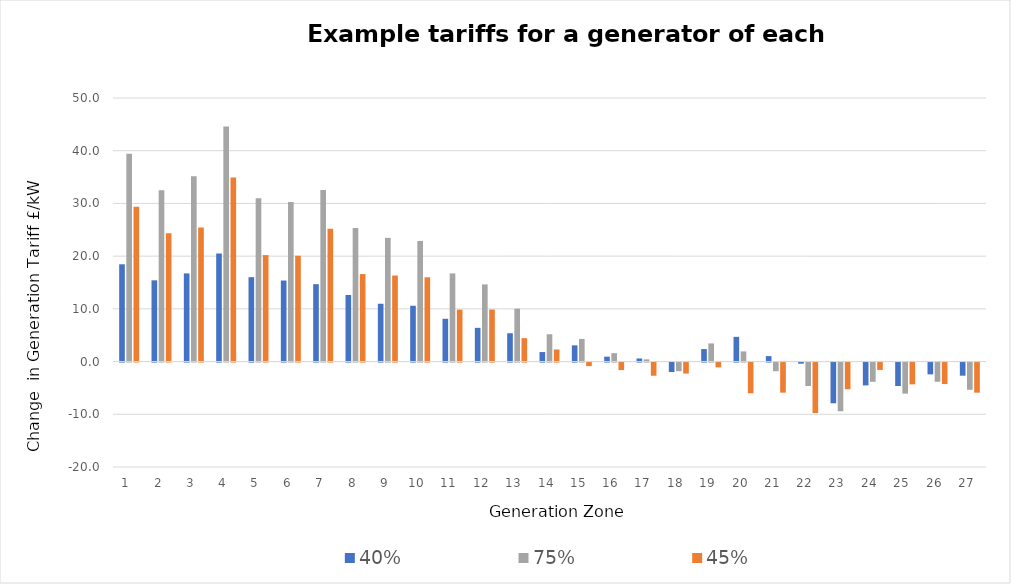
| Category | 40% | 75% | 45% |
|---|---|---|---|
| 1.0 | 18.457 | 39.446 | 29.355 |
| 2.0 | 15.413 | 32.486 | 24.32 |
| 3.0 | 16.728 | 35.138 | 25.434 |
| 4.0 | 20.501 | 44.603 | 34.922 |
| 5.0 | 16.007 | 31.002 | 20.197 |
| 6.0 | 15.374 | 30.292 | 20.077 |
| 7.0 | 14.683 | 32.545 | 25.215 |
| 8.0 | 12.626 | 25.317 | 16.598 |
| 9.0 | 10.967 | 23.475 | 16.318 |
| 10.0 | 10.592 | 22.881 | 15.992 |
| 11.0 | 8.118 | 16.723 | 9.851 |
| 12.0 | 6.399 | 14.64 | 9.879 |
| 13.0 | 5.373 | 10.038 | 4.444 |
| 14.0 | 1.804 | 5.179 | 2.295 |
| 15.0 | 3.077 | 4.299 | -0.671 |
| 16.0 | 0.932 | 1.595 | -1.425 |
| 17.0 | 0.592 | 0.421 | -2.496 |
| 18.0 | -1.784 | -1.636 | -2.086 |
| 19.0 | 2.371 | 3.446 | -0.894 |
| 20.0 | 4.69 | 1.932 | -5.822 |
| 21.0 | 1.036 | -1.635 | -5.71 |
| 22.0 | -0.216 | -4.447 | -9.589 |
| 23.0 | -7.725 | -9.239 | -5.061 |
| 24.0 | -4.335 | -3.651 | -1.396 |
| 25.0 | -4.446 | -5.894 | -4.138 |
| 26.0 | -2.238 | -3.639 | -4.077 |
| 27.0 | -2.489 | -5.161 | -5.712 |